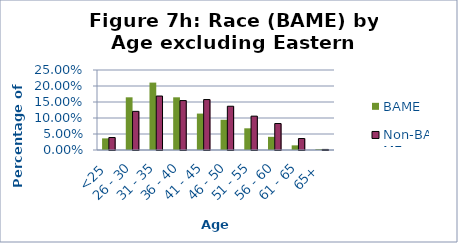
| Category | BAME | Non-BAME |
|---|---|---|
| <25 | 0.036 | 0.039 |
| 26 - 30 | 0.165 | 0.121 |
| 31 - 35 | 0.211 | 0.169 |
| 36 - 40 | 0.165 | 0.154 |
| 41 - 45 | 0.114 | 0.158 |
| 46 - 50 | 0.094 | 0.137 |
| 51 - 55 | 0.068 | 0.106 |
| 56 - 60 | 0.041 | 0.083 |
| 61 - 65 | 0.015 | 0.036 |
| 65+ | 0.002 | 0.002 |